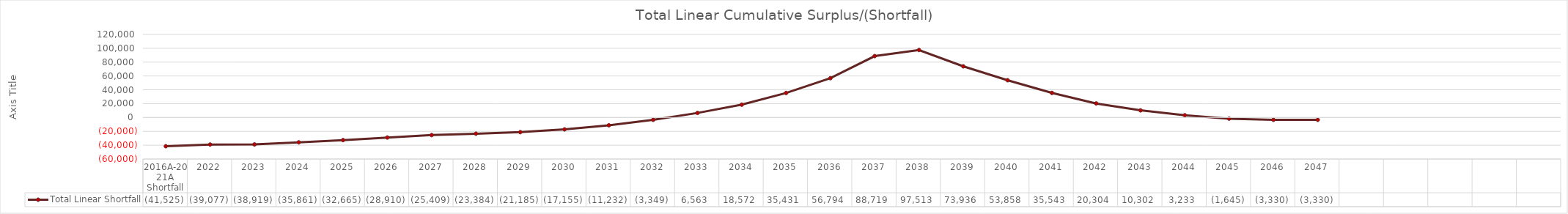
| Category | Total Linear Shortfall |
|---|---|
| 2016A-2021A Shortfall | -41524.912 |
| 2022 | -39076.587 |
| 2023 | -38919.019 |
| 2024 | -35861.444 |
| 2025 | -32664.791 |
| 2026 | -28909.985 |
| 2027 | -25409.355 |
| 2028 | -23383.74 |
| 2029 | -21184.598 |
| 2030 | -17155.227 |
| 2031 | -11231.916 |
| 2032 | -3348.737 |
| 2033 | 6562.535 |
| 2034 | 18572.498 |
| 2035 | 35430.626 |
| 2036 | 56794.063 |
| 2037 | 88718.676 |
| 2038 | 97512.932 |
| 2039 | 73936.117 |
| 2040 | 53857.66 |
| 2041 | 35543.086 |
| 2042 | 20304.263 |
| 2043 | 10301.648 |
| 2044 | 3233.009 |
| 2045 | -1644.51 |
| 2046 | -3330.001 |
| 2047 | -3330.001 |